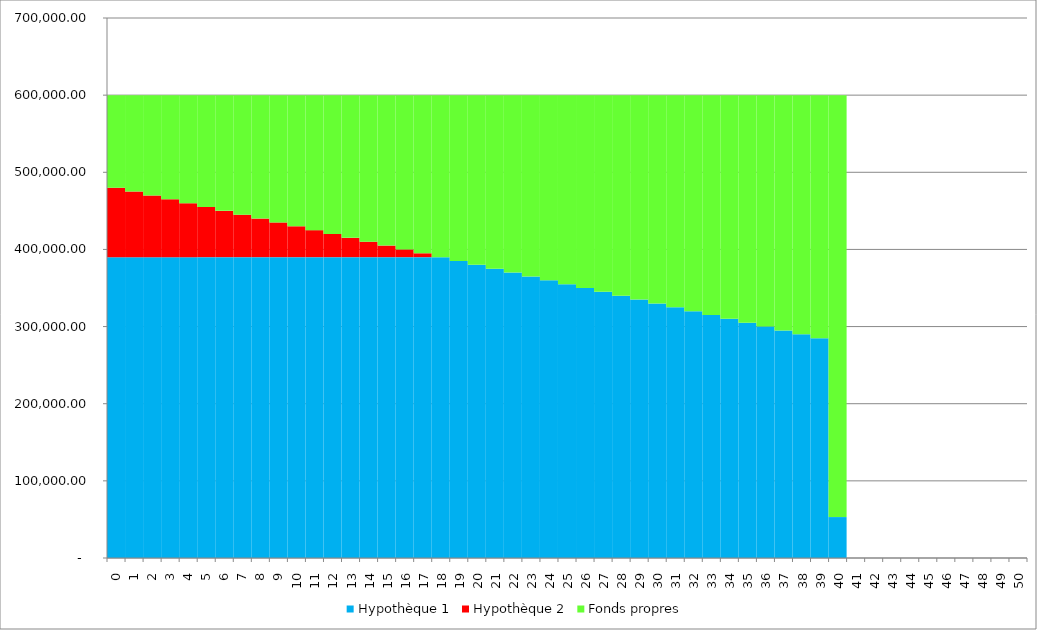
| Category | Hypothèque 1 | Hypothèque 2 | Fonds propres |
|---|---|---|---|
| 0.0 | 390000 | 90000 | 120000 |
| 1.0 | 390000 | 85000 | 125000 |
| 2.0 | 390000 | 80000 | 130000 |
| 3.0 | 390000 | 75000 | 135000 |
| 4.0 | 390000 | 70000 | 140000 |
| 5.0 | 390000 | 65000 | 145000 |
| 6.0 | 390000 | 60000 | 150000 |
| 7.0 | 390000 | 55000 | 155000 |
| 8.0 | 390000 | 50000 | 160000 |
| 9.0 | 390000 | 45000 | 165000 |
| 10.0 | 390000 | 40000 | 170000 |
| 11.0 | 390000 | 35000 | 175000 |
| 12.0 | 390000 | 30000 | 180000 |
| 13.0 | 390000 | 25000 | 185000 |
| 14.0 | 390000 | 20000 | 190000 |
| 15.0 | 390000 | 15000 | 195000 |
| 16.0 | 390000 | 10000 | 200000 |
| 17.0 | 390000 | 5000 | 205000 |
| 18.0 | 390000 | 0 | 210000 |
| 19.0 | 385000 | 0 | 215000 |
| 20.0 | 380000 | 0 | 220000 |
| 21.0 | 375000 | 0 | 225000 |
| 22.0 | 370000 | 0 | 230000 |
| 23.0 | 365000 | 0 | 235000 |
| 24.0 | 360000 | 0 | 240000 |
| 25.0 | 355000 | 0 | 245000 |
| 26.0 | 350000 | 0 | 250000 |
| 27.0 | 345000 | 0 | 255000 |
| 28.0 | 340000 | 0 | 260000 |
| 29.0 | 335000 | 0 | 265000 |
| 30.0 | 330000 | 0 | 270000 |
| 31.0 | 325000 | 0 | 275000 |
| 32.0 | 320000 | 0 | 280000 |
| 33.0 | 315000 | 0 | 285000 |
| 34.0 | 310000 | 0 | 290000 |
| 35.0 | 305000 | 0 | 295000 |
| 36.0 | 300000 | 0 | 300000 |
| 37.0 | 295000 | 0 | 305000 |
| 38.0 | 290000 | 0 | 310000 |
| 39.0 | 285000 | 0 | 315000 |
| 40.0 | 53045 | 0 | 546955 |
| 41.0 | 0 | 0 | 0 |
| 42.0 | 0 | 0 | 0 |
| 43.0 | 0 | 0 | 0 |
| 44.0 | 0 | 0 | 0 |
| 45.0 | 0 | 0 | 0 |
| 46.0 | 0 | 0 | 0 |
| 47.0 | 0 | 0 | 0 |
| 48.0 | 0 | 0 | 0 |
| 49.0 | 0 | 0 | 0 |
| 50.0 | 0 | 0 | 0 |